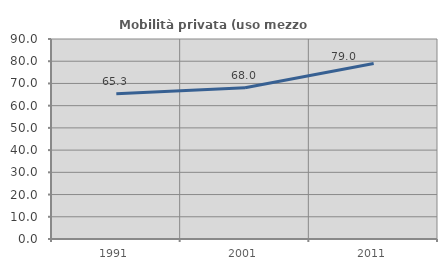
| Category | Mobilità privata (uso mezzo privato) |
|---|---|
| 1991.0 | 65.339 |
| 2001.0 | 68.033 |
| 2011.0 | 79 |